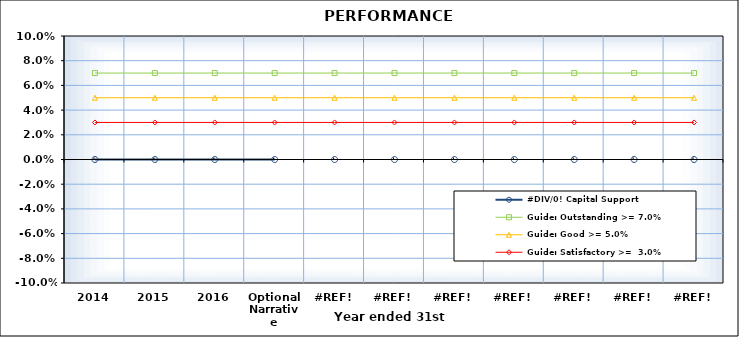
| Category | #DIV/0! Capital Support | Guide: Outstanding >= 7.0% | Guide: Good >= 5.0% | Guide: Satisfactory >=  3.0% |
|---|---|---|---|---|
| 2014 |  | 0.07 | 0.05 | 0.03 |
| 2015 |  | 0.07 | 0.05 | 0.03 |
| 2016 |  | 0.07 | 0.05 | 0.03 |
| Optional Narrative |  | 0.07 | 0.05 | 0.03 |
| #REF! |  | 0.07 | 0.05 | 0.03 |
| #REF! |  | 0.07 | 0.05 | 0.03 |
| #REF! |  | 0.07 | 0.05 | 0.03 |
| #REF! |  | 0.07 | 0.05 | 0.03 |
| #REF! |  | 0.07 | 0.05 | 0.03 |
| #REF! |  | 0.07 | 0.05 | 0.03 |
| #REF! |  | 0.07 | 0.05 | 0.03 |